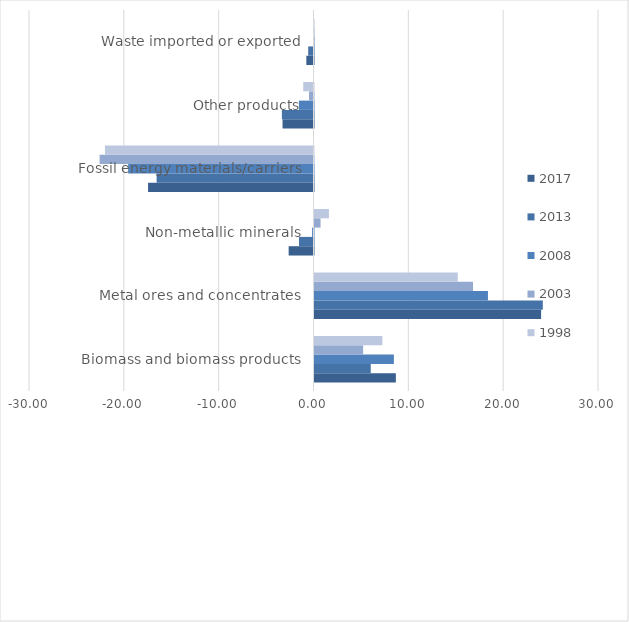
| Category | 2017 | 2013 | 2008 | 2003 | 1998 |
|---|---|---|---|---|---|
| Biomass and biomass products | 8.58 | 5.93 | 8.37 | 5.129 | 7.155 |
| Metal ores and concentrates | 23.896 | 24.076 | 18.291 | 16.716 | 15.11 |
| Non-metallic minerals | -2.619 | -1.529 | -0.148 | 0.636 | 1.521 |
| Fossil energy materials/carriers | -17.445 | -16.543 | -19.543 | -22.552 | -21.988 |
| Other products | -3.265 | -3.334 | -1.537 | -0.472 | -1.083 |
| Waste imported or exported | -0.756 | -0.56 | -0.027 | -0.002 | 0 |